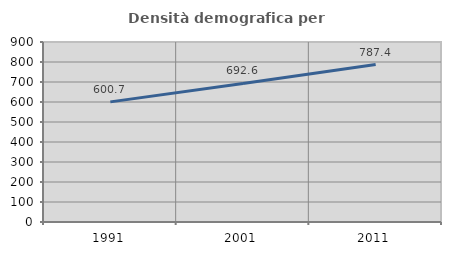
| Category | Densità demografica |
|---|---|
| 1991.0 | 600.672 |
| 2001.0 | 692.551 |
| 2011.0 | 787.394 |